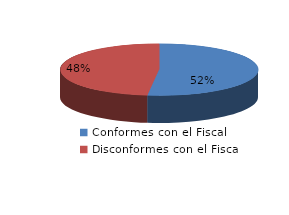
| Category | Series 0 |
|---|---|
| 0 | 463 |
| 1 | 430 |